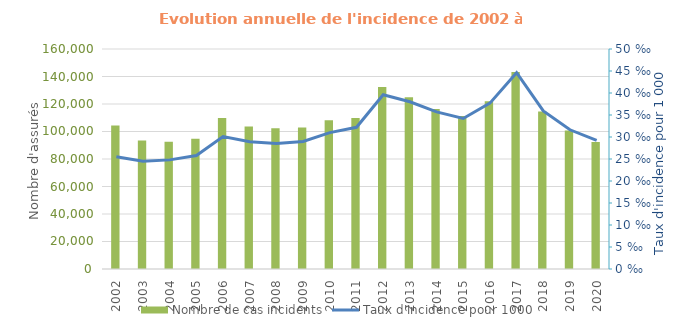
| Category | Nombre de cas incidents |
|---|---|
| 2002.0 | 104381 |
| 2003.0 | 93419 |
| 2004.0 | 92543 |
| 2005.0 | 94738 |
| 2006.0 | 109835 |
| 2007.0 | 103653 |
| 2008.0 | 102310 |
| 2009.0 | 102975 |
| 2010.0 | 108097 |
| 2011.0 | 109743 |
| 2012.0 | 132425 |
| 2013.0 | 124914 |
| 2014.0 | 116344 |
| 2015.0 | 111261 |
| 2016.0 | 122081 |
| 2017.0 | 143257 |
| 2018.0 | 114582 |
| 2019.0 | 100687 |
| 2020.0 | 92326 |